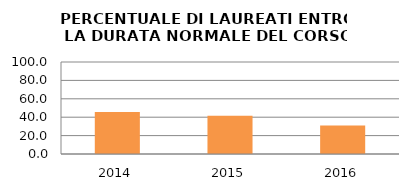
| Category | 2014 2015 2016 |
|---|---|
| 2014.0 | 45.545 |
| 2015.0 | 41.463 |
| 2016.0 | 30.851 |